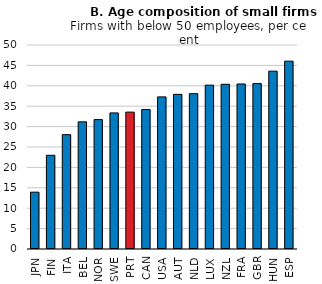
| Category | Young (0-5 years-old) |
|---|---|
| JPN | 13.927 |
| FIN | 22.974 |
| ITA | 28.027 |
| BEL | 31.161 |
| NOR | 31.713 |
| SWE | 33.355 |
| PRT | 33.545 |
| CAN | 34.19 |
| USA | 37.283 |
| AUT | 37.899 |
| NLD | 38.068 |
| LUX | 40.162 |
| NZL | 40.372 |
| FRA | 40.441 |
| GBR | 40.546 |
| HUN | 43.588 |
| ESP | 46.038 |